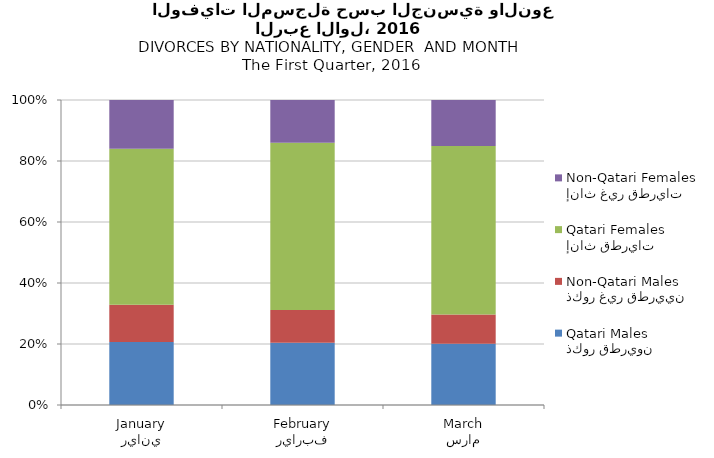
| Category | ذكور قطريون
Qatari Males | ذكور غير قطريين
Non-Qatari Males | إناث قطريات
Qatari Females | إناث غير قطريات
Non-Qatari Females |
|---|---|---|---|---|
| يناير
January | 44 | 26 | 109 | 34 |
| فبراير
February | 38 | 20 | 102 | 26 |
| مارس
March | 40 | 19 | 110 | 30 |